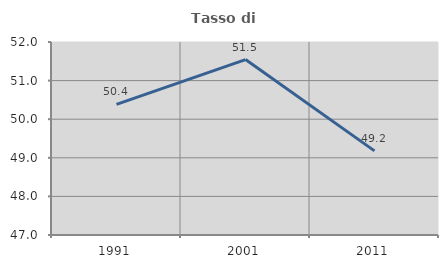
| Category | Tasso di occupazione   |
|---|---|
| 1991.0 | 50.383 |
| 2001.0 | 51.544 |
| 2011.0 | 49.179 |